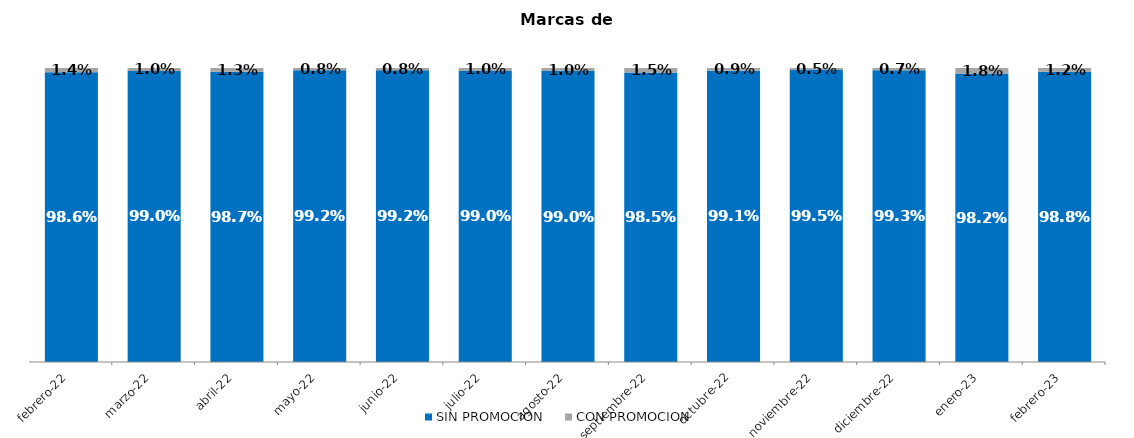
| Category | SIN PROMOCION   | CON PROMOCION   |
|---|---|---|
| 2022-02-01 | 0.986 | 0.014 |
| 2022-03-01 | 0.99 | 0.01 |
| 2022-04-01 | 0.987 | 0.013 |
| 2022-05-01 | 0.992 | 0.008 |
| 2022-06-01 | 0.992 | 0.008 |
| 2022-07-01 | 0.99 | 0.01 |
| 2022-08-01 | 0.99 | 0.01 |
| 2022-09-01 | 0.985 | 0.015 |
| 2022-10-01 | 0.991 | 0.009 |
| 2022-11-01 | 0.995 | 0.005 |
| 2022-12-01 | 0.993 | 0.007 |
| 2023-01-01 | 0.982 | 0.018 |
| 2023-02-01 | 0.988 | 0.012 |